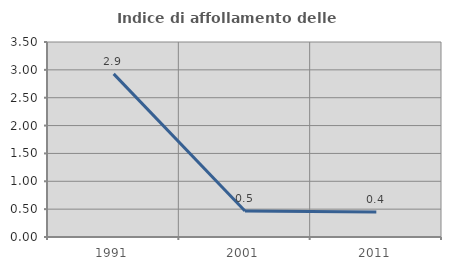
| Category | Indice di affollamento delle abitazioni  |
|---|---|
| 1991.0 | 2.928 |
| 2001.0 | 0.466 |
| 2011.0 | 0.449 |